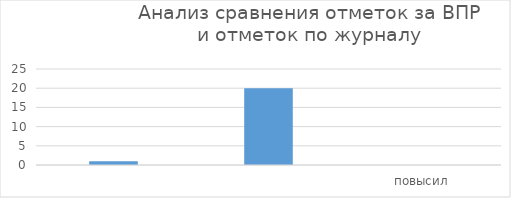
| Category | Series 0 |
|---|---|
|  | 1 |
|  | 20 |
| повысил | 0 |